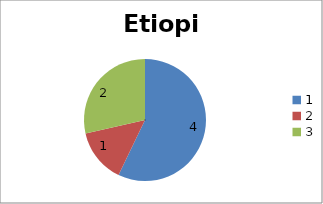
| Category | Etiopia |
|---|---|
| 0 | 4 |
| 1 | 1 |
| 2 | 2 |